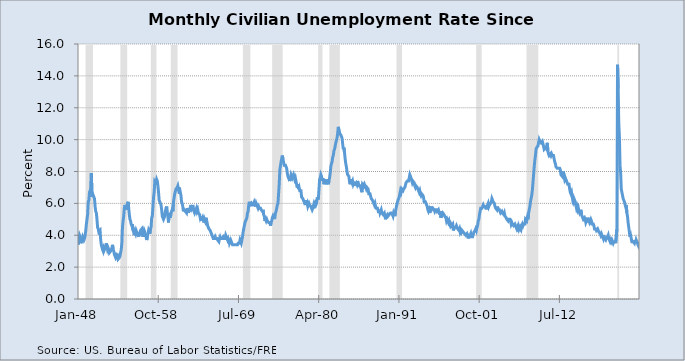
| Category | Series 0 |
|---|---|
| 17533.0 | 3.4 |
| 17564.0 | 3.8 |
| 17593.0 | 4 |
| 17624.0 | 3.9 |
| 17654.0 | 3.5 |
| 17685.0 | 3.6 |
| 17715.0 | 3.6 |
| 17746.0 | 3.9 |
| 17777.0 | 3.8 |
| 17807.0 | 3.7 |
| 17838.0 | 3.8 |
| 17868.0 | 4 |
| 17899.0 | 4.3 |
| 17930.0 | 4.7 |
| 17958.0 | 5 |
| 17989.0 | 5.3 |
| 18019.0 | 6.1 |
| 18050.0 | 6.2 |
| 18080.0 | 6.7 |
| 18111.0 | 6.8 |
| 18142.0 | 6.6 |
| 18172.0 | 7.9 |
| 18203.0 | 6.4 |
| 18233.0 | 6.6 |
| 18264.0 | 6.5 |
| 18295.0 | 6.4 |
| 18323.0 | 6.3 |
| 18354.0 | 5.8 |
| 18384.0 | 5.5 |
| 18415.0 | 5.4 |
| 18445.0 | 5 |
| 18476.0 | 4.5 |
| 18507.0 | 4.4 |
| 18537.0 | 4.2 |
| 18568.0 | 4.2 |
| 18598.0 | 4.3 |
| 18629.0 | 3.7 |
| 18660.0 | 3.4 |
| 18688.0 | 3.4 |
| 18719.0 | 3.1 |
| 18749.0 | 3 |
| 18780.0 | 3.2 |
| 18810.0 | 3.1 |
| 18841.0 | 3.1 |
| 18872.0 | 3.3 |
| 18902.0 | 3.5 |
| 18933.0 | 3.5 |
| 18963.0 | 3.1 |
| 18994.0 | 3.2 |
| 19025.0 | 3.1 |
| 19054.0 | 2.9 |
| 19085.0 | 2.9 |
| 19115.0 | 3 |
| 19146.0 | 3 |
| 19176.0 | 3.2 |
| 19207.0 | 3.4 |
| 19238.0 | 3.1 |
| 19268.0 | 3 |
| 19299.0 | 2.8 |
| 19329.0 | 2.7 |
| 19360.0 | 2.9 |
| 19391.0 | 2.6 |
| 19419.0 | 2.6 |
| 19450.0 | 2.7 |
| 19480.0 | 2.5 |
| 19511.0 | 2.5 |
| 19541.0 | 2.6 |
| 19572.0 | 2.7 |
| 19603.0 | 2.9 |
| 19633.0 | 3.1 |
| 19664.0 | 3.5 |
| 19694.0 | 4.5 |
| 19725.0 | 4.9 |
| 19756.0 | 5.2 |
| 19784.0 | 5.7 |
| 19815.0 | 5.9 |
| 19845.0 | 5.9 |
| 19876.0 | 5.6 |
| 19906.0 | 5.8 |
| 19937.0 | 6 |
| 19968.0 | 6.1 |
| 19998.0 | 5.7 |
| 20029.0 | 5.3 |
| 20059.0 | 5 |
| 20090.0 | 4.9 |
| 20121.0 | 4.7 |
| 20149.0 | 4.6 |
| 20180.0 | 4.7 |
| 20210.0 | 4.3 |
| 20241.0 | 4.2 |
| 20271.0 | 4 |
| 20302.0 | 4.2 |
| 20333.0 | 4.1 |
| 20363.0 | 4.3 |
| 20394.0 | 4.2 |
| 20424.0 | 4.2 |
| 20455.0 | 4 |
| 20486.0 | 3.9 |
| 20515.0 | 4.2 |
| 20546.0 | 4 |
| 20576.0 | 4.3 |
| 20607.0 | 4.3 |
| 20637.0 | 4.4 |
| 20668.0 | 4.1 |
| 20699.0 | 3.9 |
| 20729.0 | 3.9 |
| 20760.0 | 4.3 |
| 20790.0 | 4.2 |
| 20821.0 | 4.2 |
| 20852.0 | 3.9 |
| 20880.0 | 3.7 |
| 20911.0 | 3.9 |
| 20941.0 | 4.1 |
| 20972.0 | 4.3 |
| 21002.0 | 4.2 |
| 21033.0 | 4.1 |
| 21064.0 | 4.4 |
| 21094.0 | 4.5 |
| 21125.0 | 5.1 |
| 21155.0 | 5.2 |
| 21186.0 | 5.8 |
| 21217.0 | 6.4 |
| 21245.0 | 6.7 |
| 21276.0 | 7.4 |
| 21306.0 | 7.4 |
| 21337.0 | 7.3 |
| 21367.0 | 7.5 |
| 21398.0 | 7.4 |
| 21429.0 | 7.1 |
| 21459.0 | 6.7 |
| 21490.0 | 6.2 |
| 21520.0 | 6.2 |
| 21551.0 | 6 |
| 21582.0 | 5.9 |
| 21610.0 | 5.6 |
| 21641.0 | 5.2 |
| 21671.0 | 5.1 |
| 21702.0 | 5 |
| 21732.0 | 5.1 |
| 21763.0 | 5.2 |
| 21794.0 | 5.5 |
| 21824.0 | 5.7 |
| 21855.0 | 5.8 |
| 21885.0 | 5.3 |
| 21916.0 | 5.2 |
| 21947.0 | 4.8 |
| 21976.0 | 5.4 |
| 22007.0 | 5.2 |
| 22037.0 | 5.1 |
| 22068.0 | 5.4 |
| 22098.0 | 5.5 |
| 22129.0 | 5.6 |
| 22160.0 | 5.5 |
| 22190.0 | 6.1 |
| 22221.0 | 6.1 |
| 22251.0 | 6.6 |
| 22282.0 | 6.6 |
| 22313.0 | 6.9 |
| 22341.0 | 6.9 |
| 22372.0 | 7 |
| 22402.0 | 7.1 |
| 22433.0 | 6.9 |
| 22463.0 | 7 |
| 22494.0 | 6.6 |
| 22525.0 | 6.7 |
| 22555.0 | 6.5 |
| 22586.0 | 6.1 |
| 22616.0 | 6 |
| 22647.0 | 5.8 |
| 22678.0 | 5.5 |
| 22706.0 | 5.6 |
| 22737.0 | 5.6 |
| 22767.0 | 5.5 |
| 22798.0 | 5.5 |
| 22828.0 | 5.4 |
| 22859.0 | 5.7 |
| 22890.0 | 5.6 |
| 22920.0 | 5.4 |
| 22951.0 | 5.7 |
| 22981.0 | 5.5 |
| 23012.0 | 5.7 |
| 23043.0 | 5.9 |
| 23071.0 | 5.7 |
| 23102.0 | 5.7 |
| 23132.0 | 5.9 |
| 23163.0 | 5.6 |
| 23193.0 | 5.6 |
| 23224.0 | 5.4 |
| 23255.0 | 5.5 |
| 23285.0 | 5.5 |
| 23316.0 | 5.7 |
| 23346.0 | 5.5 |
| 23377.0 | 5.6 |
| 23408.0 | 5.4 |
| 23437.0 | 5.4 |
| 23468.0 | 5.3 |
| 23498.0 | 5.1 |
| 23529.0 | 5.2 |
| 23559.0 | 4.9 |
| 23590.0 | 5 |
| 23621.0 | 5.1 |
| 23651.0 | 5.1 |
| 23682.0 | 4.8 |
| 23712.0 | 5 |
| 23743.0 | 4.9 |
| 23774.0 | 5.1 |
| 23802.0 | 4.7 |
| 23833.0 | 4.8 |
| 23863.0 | 4.6 |
| 23894.0 | 4.6 |
| 23924.0 | 4.4 |
| 23955.0 | 4.4 |
| 23986.0 | 4.3 |
| 24016.0 | 4.2 |
| 24047.0 | 4.1 |
| 24077.0 | 4 |
| 24108.0 | 4 |
| 24139.0 | 3.8 |
| 24167.0 | 3.8 |
| 24198.0 | 3.8 |
| 24228.0 | 3.9 |
| 24259.0 | 3.8 |
| 24289.0 | 3.8 |
| 24320.0 | 3.8 |
| 24351.0 | 3.7 |
| 24381.0 | 3.7 |
| 24412.0 | 3.6 |
| 24442.0 | 3.8 |
| 24473.0 | 3.9 |
| 24504.0 | 3.8 |
| 24532.0 | 3.8 |
| 24563.0 | 3.8 |
| 24593.0 | 3.8 |
| 24624.0 | 3.9 |
| 24654.0 | 3.8 |
| 24685.0 | 3.8 |
| 24716.0 | 3.8 |
| 24746.0 | 4 |
| 24777.0 | 3.9 |
| 24807.0 | 3.8 |
| 24838.0 | 3.7 |
| 24869.0 | 3.8 |
| 24898.0 | 3.7 |
| 24929.0 | 3.5 |
| 24959.0 | 3.5 |
| 24990.0 | 3.7 |
| 25020.0 | 3.7 |
| 25051.0 | 3.5 |
| 25082.0 | 3.4 |
| 25112.0 | 3.4 |
| 25143.0 | 3.4 |
| 25173.0 | 3.4 |
| 25204.0 | 3.4 |
| 25235.0 | 3.4 |
| 25263.0 | 3.4 |
| 25294.0 | 3.4 |
| 25324.0 | 3.4 |
| 25355.0 | 3.5 |
| 25385.0 | 3.5 |
| 25416.0 | 3.5 |
| 25447.0 | 3.7 |
| 25477.0 | 3.7 |
| 25508.0 | 3.5 |
| 25538.0 | 3.5 |
| 25569.0 | 3.9 |
| 25600.0 | 4.2 |
| 25628.0 | 4.4 |
| 25659.0 | 4.6 |
| 25689.0 | 4.8 |
| 25720.0 | 4.9 |
| 25750.0 | 5 |
| 25781.0 | 5.1 |
| 25812.0 | 5.4 |
| 25842.0 | 5.5 |
| 25873.0 | 5.9 |
| 25903.0 | 6.1 |
| 25934.0 | 5.9 |
| 25965.0 | 5.9 |
| 25993.0 | 6 |
| 26024.0 | 5.9 |
| 26054.0 | 5.9 |
| 26085.0 | 5.9 |
| 26115.0 | 6 |
| 26146.0 | 6.1 |
| 26177.0 | 6 |
| 26207.0 | 5.8 |
| 26238.0 | 6 |
| 26268.0 | 6 |
| 26299.0 | 5.8 |
| 26330.0 | 5.7 |
| 26359.0 | 5.8 |
| 26390.0 | 5.7 |
| 26420.0 | 5.7 |
| 26451.0 | 5.7 |
| 26481.0 | 5.6 |
| 26512.0 | 5.6 |
| 26543.0 | 5.5 |
| 26573.0 | 5.6 |
| 26604.0 | 5.3 |
| 26634.0 | 5.2 |
| 26665.0 | 4.9 |
| 26696.0 | 5 |
| 26724.0 | 4.9 |
| 26755.0 | 5 |
| 26785.0 | 4.9 |
| 26816.0 | 4.9 |
| 26846.0 | 4.8 |
| 26877.0 | 4.8 |
| 26908.0 | 4.8 |
| 26938.0 | 4.6 |
| 26969.0 | 4.8 |
| 26999.0 | 4.9 |
| 27030.0 | 5.1 |
| 27061.0 | 5.2 |
| 27089.0 | 5.1 |
| 27120.0 | 5.1 |
| 27150.0 | 5.1 |
| 27181.0 | 5.4 |
| 27211.0 | 5.5 |
| 27242.0 | 5.5 |
| 27273.0 | 5.9 |
| 27303.0 | 6 |
| 27334.0 | 6.6 |
| 27364.0 | 7.2 |
| 27395.0 | 8.1 |
| 27426.0 | 8.1 |
| 27454.0 | 8.6 |
| 27485.0 | 8.8 |
| 27515.0 | 9 |
| 27546.0 | 8.8 |
| 27576.0 | 8.6 |
| 27607.0 | 8.4 |
| 27638.0 | 8.4 |
| 27668.0 | 8.4 |
| 27699.0 | 8.3 |
| 27729.0 | 8.2 |
| 27760.0 | 7.9 |
| 27791.0 | 7.7 |
| 27820.0 | 7.6 |
| 27851.0 | 7.7 |
| 27881.0 | 7.4 |
| 27912.0 | 7.6 |
| 27942.0 | 7.8 |
| 27973.0 | 7.8 |
| 28004.0 | 7.6 |
| 28034.0 | 7.7 |
| 28065.0 | 7.8 |
| 28095.0 | 7.8 |
| 28126.0 | 7.5 |
| 28157.0 | 7.6 |
| 28185.0 | 7.4 |
| 28216.0 | 7.2 |
| 28246.0 | 7 |
| 28277.0 | 7.2 |
| 28307.0 | 6.9 |
| 28338.0 | 7 |
| 28369.0 | 6.8 |
| 28399.0 | 6.8 |
| 28430.0 | 6.8 |
| 28460.0 | 6.4 |
| 28491.0 | 6.4 |
| 28522.0 | 6.3 |
| 28550.0 | 6.3 |
| 28581.0 | 6.1 |
| 28611.0 | 6 |
| 28642.0 | 5.9 |
| 28672.0 | 6.2 |
| 28703.0 | 5.9 |
| 28734.0 | 6 |
| 28764.0 | 5.8 |
| 28795.0 | 5.9 |
| 28825.0 | 6 |
| 28856.0 | 5.9 |
| 28887.0 | 5.9 |
| 28915.0 | 5.8 |
| 28946.0 | 5.8 |
| 28976.0 | 5.6 |
| 29007.0 | 5.7 |
| 29037.0 | 5.7 |
| 29068.0 | 6 |
| 29099.0 | 5.9 |
| 29129.0 | 6 |
| 29160.0 | 5.9 |
| 29190.0 | 6 |
| 29221.0 | 6.3 |
| 29252.0 | 6.3 |
| 29281.0 | 6.3 |
| 29312.0 | 6.9 |
| 29342.0 | 7.5 |
| 29373.0 | 7.6 |
| 29403.0 | 7.8 |
| 29434.0 | 7.7 |
| 29465.0 | 7.5 |
| 29495.0 | 7.5 |
| 29526.0 | 7.5 |
| 29556.0 | 7.2 |
| 29587.0 | 7.5 |
| 29618.0 | 7.4 |
| 29646.0 | 7.4 |
| 29677.0 | 7.2 |
| 29707.0 | 7.5 |
| 29738.0 | 7.5 |
| 29768.0 | 7.2 |
| 29799.0 | 7.4 |
| 29830.0 | 7.6 |
| 29860.0 | 7.9 |
| 29891.0 | 8.3 |
| 29921.0 | 8.5 |
| 29952.0 | 8.6 |
| 29983.0 | 8.9 |
| 30011.0 | 9 |
| 30042.0 | 9.3 |
| 30072.0 | 9.4 |
| 30103.0 | 9.6 |
| 30133.0 | 9.8 |
| 30164.0 | 9.8 |
| 30195.0 | 10.1 |
| 30225.0 | 10.4 |
| 30256.0 | 10.8 |
| 30286.0 | 10.8 |
| 30317.0 | 10.4 |
| 30348.0 | 10.4 |
| 30376.0 | 10.3 |
| 30407.0 | 10.2 |
| 30437.0 | 10.1 |
| 30468.0 | 10.1 |
| 30498.0 | 9.4 |
| 30529.0 | 9.5 |
| 30560.0 | 9.2 |
| 30590.0 | 8.8 |
| 30621.0 | 8.5 |
| 30651.0 | 8.3 |
| 30682.0 | 8 |
| 30713.0 | 7.8 |
| 30742.0 | 7.8 |
| 30773.0 | 7.7 |
| 30803.0 | 7.4 |
| 30834.0 | 7.2 |
| 30864.0 | 7.5 |
| 30895.0 | 7.5 |
| 30926.0 | 7.3 |
| 30956.0 | 7.4 |
| 30987.0 | 7.2 |
| 31017.0 | 7.3 |
| 31048.0 | 7.3 |
| 31079.0 | 7.2 |
| 31107.0 | 7.2 |
| 31138.0 | 7.3 |
| 31168.0 | 7.2 |
| 31199.0 | 7.4 |
| 31229.0 | 7.4 |
| 31260.0 | 7.1 |
| 31291.0 | 7.1 |
| 31321.0 | 7.1 |
| 31352.0 | 7 |
| 31382.0 | 7 |
| 31413.0 | 6.7 |
| 31444.0 | 7.2 |
| 31472.0 | 7.2 |
| 31503.0 | 7.1 |
| 31533.0 | 7.2 |
| 31564.0 | 7.2 |
| 31594.0 | 7 |
| 31625.0 | 6.9 |
| 31656.0 | 7 |
| 31686.0 | 7 |
| 31717.0 | 6.9 |
| 31747.0 | 6.6 |
| 31778.0 | 6.6 |
| 31809.0 | 6.6 |
| 31837.0 | 6.6 |
| 31868.0 | 6.3 |
| 31898.0 | 6.3 |
| 31929.0 | 6.2 |
| 31959.0 | 6.1 |
| 31990.0 | 6 |
| 32021.0 | 5.9 |
| 32051.0 | 6 |
| 32082.0 | 5.8 |
| 32112.0 | 5.7 |
| 32143.0 | 5.7 |
| 32174.0 | 5.7 |
| 32203.0 | 5.7 |
| 32234.0 | 5.4 |
| 32264.0 | 5.6 |
| 32295.0 | 5.4 |
| 32325.0 | 5.4 |
| 32356.0 | 5.6 |
| 32387.0 | 5.4 |
| 32417.0 | 5.4 |
| 32448.0 | 5.3 |
| 32478.0 | 5.3 |
| 32509.0 | 5.4 |
| 32540.0 | 5.2 |
| 32568.0 | 5 |
| 32599.0 | 5.2 |
| 32629.0 | 5.2 |
| 32660.0 | 5.3 |
| 32690.0 | 5.2 |
| 32721.0 | 5.2 |
| 32752.0 | 5.3 |
| 32782.0 | 5.3 |
| 32813.0 | 5.4 |
| 32843.0 | 5.4 |
| 32874.0 | 5.4 |
| 32905.0 | 5.3 |
| 32933.0 | 5.2 |
| 32964.0 | 5.4 |
| 32994.0 | 5.4 |
| 33025.0 | 5.2 |
| 33055.0 | 5.5 |
| 33086.0 | 5.7 |
| 33117.0 | 5.9 |
| 33147.0 | 5.9 |
| 33178.0 | 6.2 |
| 33208.0 | 6.3 |
| 33239.0 | 6.4 |
| 33270.0 | 6.6 |
| 33298.0 | 6.8 |
| 33329.0 | 6.7 |
| 33359.0 | 6.9 |
| 33390.0 | 6.9 |
| 33420.0 | 6.8 |
| 33451.0 | 6.9 |
| 33482.0 | 6.9 |
| 33512.0 | 7 |
| 33543.0 | 7 |
| 33573.0 | 7.3 |
| 33604.0 | 7.3 |
| 33635.0 | 7.4 |
| 33664.0 | 7.4 |
| 33695.0 | 7.4 |
| 33725.0 | 7.6 |
| 33756.0 | 7.8 |
| 33786.0 | 7.7 |
| 33817.0 | 7.6 |
| 33848.0 | 7.6 |
| 33878.0 | 7.3 |
| 33909.0 | 7.4 |
| 33939.0 | 7.4 |
| 33970.0 | 7.3 |
| 34001.0 | 7.1 |
| 34029.0 | 7 |
| 34060.0 | 7.1 |
| 34090.0 | 7.1 |
| 34121.0 | 7 |
| 34151.0 | 6.9 |
| 34182.0 | 6.8 |
| 34213.0 | 6.7 |
| 34243.0 | 6.8 |
| 34274.0 | 6.6 |
| 34304.0 | 6.5 |
| 34335.0 | 6.6 |
| 34366.0 | 6.6 |
| 34394.0 | 6.5 |
| 34425.0 | 6.4 |
| 34455.0 | 6.1 |
| 34486.0 | 6.1 |
| 34516.0 | 6.1 |
| 34547.0 | 6 |
| 34578.0 | 5.9 |
| 34608.0 | 5.8 |
| 34639.0 | 5.6 |
| 34669.0 | 5.5 |
| 34700.0 | 5.6 |
| 34731.0 | 5.4 |
| 34759.0 | 5.4 |
| 34790.0 | 5.8 |
| 34820.0 | 5.6 |
| 34851.0 | 5.6 |
| 34881.0 | 5.7 |
| 34912.0 | 5.7 |
| 34943.0 | 5.6 |
| 34973.0 | 5.5 |
| 35004.0 | 5.6 |
| 35034.0 | 5.6 |
| 35065.0 | 5.6 |
| 35096.0 | 5.5 |
| 35125.0 | 5.5 |
| 35156.0 | 5.6 |
| 35186.0 | 5.6 |
| 35217.0 | 5.3 |
| 35247.0 | 5.5 |
| 35278.0 | 5.1 |
| 35309.0 | 5.2 |
| 35339.0 | 5.2 |
| 35370.0 | 5.4 |
| 35400.0 | 5.4 |
| 35431.0 | 5.3 |
| 35462.0 | 5.2 |
| 35490.0 | 5.2 |
| 35521.0 | 5.1 |
| 35551.0 | 4.9 |
| 35582.0 | 5 |
| 35612.0 | 4.9 |
| 35643.0 | 4.8 |
| 35674.0 | 4.9 |
| 35704.0 | 4.7 |
| 35735.0 | 4.6 |
| 35765.0 | 4.7 |
| 35796.0 | 4.6 |
| 35827.0 | 4.6 |
| 35855.0 | 4.7 |
| 35886.0 | 4.3 |
| 35916.0 | 4.4 |
| 35947.0 | 4.5 |
| 35977.0 | 4.5 |
| 36008.0 | 4.5 |
| 36039.0 | 4.6 |
| 36069.0 | 4.5 |
| 36100.0 | 4.4 |
| 36130.0 | 4.4 |
| 36161.0 | 4.3 |
| 36192.0 | 4.4 |
| 36220.0 | 4.2 |
| 36251.0 | 4.3 |
| 36281.0 | 4.2 |
| 36312.0 | 4.3 |
| 36342.0 | 4.3 |
| 36373.0 | 4.2 |
| 36404.0 | 4.2 |
| 36434.0 | 4.1 |
| 36465.0 | 4.1 |
| 36495.0 | 4 |
| 36526.0 | 4 |
| 36557.0 | 4.1 |
| 36586.0 | 4 |
| 36617.0 | 3.8 |
| 36647.0 | 4 |
| 36678.0 | 4 |
| 36708.0 | 4 |
| 36739.0 | 4.1 |
| 36770.0 | 3.9 |
| 36800.0 | 3.9 |
| 36831.0 | 3.9 |
| 36861.0 | 3.9 |
| 36892.0 | 4.2 |
| 36923.0 | 4.2 |
| 36951.0 | 4.3 |
| 36982.0 | 4.4 |
| 37012.0 | 4.3 |
| 37043.0 | 4.5 |
| 37073.0 | 4.6 |
| 37104.0 | 4.9 |
| 37135.0 | 5 |
| 37165.0 | 5.3 |
| 37196.0 | 5.5 |
| 37226.0 | 5.7 |
| 37257.0 | 5.7 |
| 37288.0 | 5.7 |
| 37316.0 | 5.7 |
| 37347.0 | 5.9 |
| 37377.0 | 5.8 |
| 37408.0 | 5.8 |
| 37438.0 | 5.8 |
| 37469.0 | 5.7 |
| 37500.0 | 5.7 |
| 37530.0 | 5.7 |
| 37561.0 | 5.9 |
| 37591.0 | 6 |
| 37622.0 | 5.8 |
| 37653.0 | 5.9 |
| 37681.0 | 5.9 |
| 37712.0 | 6 |
| 37742.0 | 6.1 |
| 37773.0 | 6.3 |
| 37803.0 | 6.2 |
| 37834.0 | 6.1 |
| 37865.0 | 6.1 |
| 37895.0 | 6 |
| 37926.0 | 5.8 |
| 37956.0 | 5.7 |
| 37987.0 | 5.7 |
| 38018.0 | 5.6 |
| 38047.0 | 5.8 |
| 38078.0 | 5.6 |
| 38108.0 | 5.6 |
| 38139.0 | 5.6 |
| 38169.0 | 5.5 |
| 38200.0 | 5.4 |
| 38231.0 | 5.4 |
| 38261.0 | 5.5 |
| 38292.0 | 5.4 |
| 38322.0 | 5.4 |
| 38353.0 | 5.3 |
| 38384.0 | 5.4 |
| 38412.0 | 5.2 |
| 38443.0 | 5.2 |
| 38473.0 | 5.1 |
| 38504.0 | 5 |
| 38534.0 | 5 |
| 38565.0 | 4.9 |
| 38596.0 | 5 |
| 38626.0 | 5 |
| 38657.0 | 5 |
| 38687.0 | 4.9 |
| 38718.0 | 4.7 |
| 38749.0 | 4.8 |
| 38777.0 | 4.7 |
| 38808.0 | 4.7 |
| 38838.0 | 4.6 |
| 38869.0 | 4.6 |
| 38899.0 | 4.7 |
| 38930.0 | 4.7 |
| 38961.0 | 4.5 |
| 38991.0 | 4.4 |
| 39022.0 | 4.5 |
| 39052.0 | 4.4 |
| 39083.0 | 4.6 |
| 39114.0 | 4.5 |
| 39142.0 | 4.4 |
| 39173.0 | 4.5 |
| 39203.0 | 4.4 |
| 39234.0 | 4.6 |
| 39264.0 | 4.7 |
| 39295.0 | 4.6 |
| 39326.0 | 4.7 |
| 39356.0 | 4.7 |
| 39387.0 | 4.7 |
| 39417.0 | 5 |
| 39448.0 | 5 |
| 39479.0 | 4.9 |
| 39508.0 | 5.1 |
| 39539.0 | 5 |
| 39569.0 | 5.4 |
| 39600.0 | 5.6 |
| 39630.0 | 5.8 |
| 39661.0 | 6.1 |
| 39692.0 | 6.1 |
| 39722.0 | 6.5 |
| 39753.0 | 6.8 |
| 39783.0 | 7.3 |
| 39814.0 | 7.8 |
| 39845.0 | 8.3 |
| 39873.0 | 8.7 |
| 39904.0 | 9 |
| 39934.0 | 9.4 |
| 39965.0 | 9.5 |
| 39995.0 | 9.5 |
| 40026.0 | 9.6 |
| 40057.0 | 9.8 |
| 40087.0 | 10 |
| 40118.0 | 9.9 |
| 40148.0 | 9.9 |
| 40179.0 | 9.8 |
| 40210.0 | 9.8 |
| 40238.0 | 9.9 |
| 40269.0 | 9.9 |
| 40299.0 | 9.6 |
| 40330.0 | 9.4 |
| 40360.0 | 9.4 |
| 40391.0 | 9.5 |
| 40422.0 | 9.5 |
| 40452.0 | 9.4 |
| 40483.0 | 9.8 |
| 40513.0 | 9.3 |
| 40544.0 | 9.1 |
| 40575.0 | 9 |
| 40603.0 | 9 |
| 40634.0 | 9.1 |
| 40664.0 | 9 |
| 40695.0 | 9.1 |
| 40725.0 | 9 |
| 40756.0 | 9 |
| 40787.0 | 9 |
| 40817.0 | 8.8 |
| 40848.0 | 8.6 |
| 40878.0 | 8.5 |
| 40909.0 | 8.3 |
| 40940.0 | 8.3 |
| 40969.0 | 8.2 |
| 41000.0 | 8.2 |
| 41030.0 | 8.2 |
| 41061.0 | 8.2 |
| 41091.0 | 8.2 |
| 41122.0 | 8.1 |
| 41153.0 | 7.8 |
| 41183.0 | 7.8 |
| 41214.0 | 7.7 |
| 41244.0 | 7.9 |
| 41275.0 | 8 |
| 41306.0 | 7.7 |
| 41334.0 | 7.5 |
| 41365.0 | 7.6 |
| 41395.0 | 7.5 |
| 41426.0 | 7.5 |
| 41456.0 | 7.3 |
| 41487.0 | 7.2 |
| 41518.0 | 7.2 |
| 41548.0 | 7.2 |
| 41579.0 | 6.9 |
| 41609.0 | 6.7 |
| 41640.0 | 6.6 |
| 41671.0 | 6.7 |
| 41699.0 | 6.7 |
| 41730.0 | 6.2 |
| 41760.0 | 6.3 |
| 41791.0 | 6.1 |
| 41821.0 | 6.2 |
| 41852.0 | 6.1 |
| 41883.0 | 5.9 |
| 41913.0 | 5.7 |
| 41944.0 | 5.8 |
| 41974.0 | 5.6 |
| 42005.0 | 5.7 |
| 42036.0 | 5.5 |
| 42064.0 | 5.4 |
| 42095.0 | 5.4 |
| 42125.0 | 5.6 |
| 42156.0 | 5.3 |
| 42186.0 | 5.2 |
| 42217.0 | 5.1 |
| 42248.0 | 5 |
| 42278.0 | 5 |
| 42309.0 | 5.1 |
| 42339.0 | 5 |
| 42370.0 | 4.8 |
| 42401.0 | 4.9 |
| 42430.0 | 5 |
| 42461.0 | 5.1 |
| 42491.0 | 4.8 |
| 42522.0 | 4.9 |
| 42552.0 | 4.8 |
| 42583.0 | 4.9 |
| 42614.0 | 5 |
| 42644.0 | 4.9 |
| 42675.0 | 4.7 |
| 42705.0 | 4.7 |
| 42736.0 | 4.7 |
| 42767.0 | 4.6 |
| 42795.0 | 4.4 |
| 42826.0 | 4.4 |
| 42856.0 | 4.4 |
| 42887.0 | 4.3 |
| 42917.0 | 4.3 |
| 42948.0 | 4.4 |
| 42979.0 | 4.3 |
| 43009.0 | 4.2 |
| 43040.0 | 4.2 |
| 43070.0 | 4.1 |
| 43101.0 | 4 |
| 43132.0 | 4.1 |
| 43160.0 | 4 |
| 43191.0 | 4 |
| 43221.0 | 3.8 |
| 43252.0 | 4 |
| 43282.0 | 3.8 |
| 43313.0 | 3.8 |
| 43344.0 | 3.7 |
| 43374.0 | 3.8 |
| 43405.0 | 3.8 |
| 43435.0 | 3.9 |
| 43466.0 | 4 |
| 43497.0 | 3.8 |
| 43525.0 | 3.8 |
| 43556.0 | 3.6 |
| 43586.0 | 3.7 |
| 43617.0 | 3.6 |
| 43647.0 | 3.7 |
| 43678.0 | 3.7 |
| 43709.0 | 3.5 |
| 43739.0 | 3.6 |
| 43770.0 | 3.6 |
| 43800.0 | 3.6 |
| 43831.0 | 3.5 |
| 43862.0 | 3.5 |
| 43891.0 | 4.4 |
| 43922.0 | 14.7 |
| 43952.0 | 13.2 |
| 43983.0 | 11 |
| 44013.0 | 10.2 |
| 44044.0 | 8.4 |
| 44075.0 | 7.9 |
| 44105.0 | 6.9 |
| 44136.0 | 6.7 |
| 44166.0 | 6.7 |
| 44197.0 | 6.3 |
| 44228.0 | 6.2 |
| 44256.0 | 6.1 |
| 44287.0 | 6.1 |
| 44317.0 | 5.8 |
| 44348.0 | 5.9 |
| 44378.0 | 5.4 |
| 44409.0 | 5.2 |
| 44440.0 | 4.8 |
| 44470.0 | 4.5 |
| 44501.0 | 4.2 |
| 44531.0 | 3.9 |
| 44562.0 | 4 |
| 44593.0 | 3.8 |
| 44621.0 | 3.6 |
| 44652.0 | 3.6 |
| 44682.0 | 3.6 |
| 44713.0 | 3.6 |
| 44743.0 | 3.5 |
| 44774.0 | 3.7 |
| 44805.0 | 3.5 |
| 44835.0 | 3.7 |
| 44866.0 | 3.6 |
| 44896.0 | 3.5 |
| 44927.0 | 3.4 |
| 44958.0 | 3.6 |